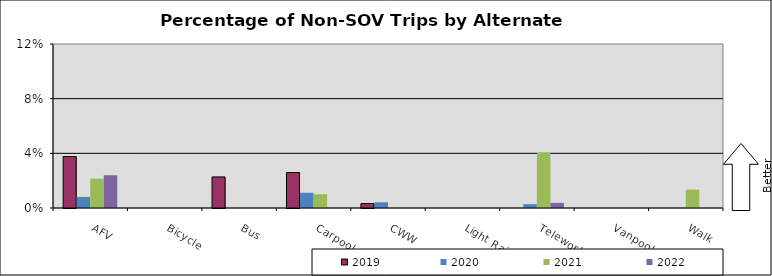
| Category | 2019 | 2020 | 2021 | 2022 |
|---|---|---|---|---|
| AFV | 0.038 | 0.008 | 0.021 | 0.024 |
| Bicycle | 0 | 0 | 0 | 0 |
| Bus | 0.023 | 0 | 0 | 0 |
| Carpool | 0.026 | 0.011 | 0.01 | 0 |
| CWW | 0.003 | 0.004 | 0 | 0 |
| Light Rail | 0 | 0 | 0 | 0 |
| Telework | 0 | 0.003 | 0.04 | 0.004 |
| Vanpool | 0 | 0 | 0 | 0 |
| Walk | 0 | 0 | 0.013 | 0 |